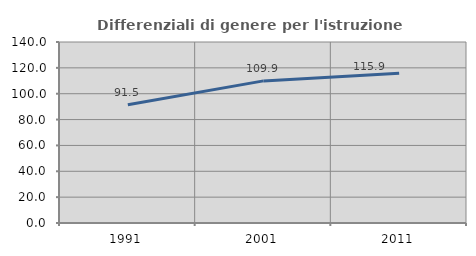
| Category | Differenziali di genere per l'istruzione superiore |
|---|---|
| 1991.0 | 91.503 |
| 2001.0 | 109.926 |
| 2011.0 | 115.893 |